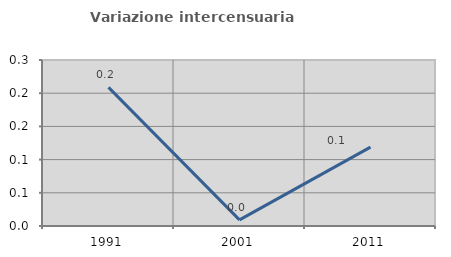
| Category | Variazione intercensuaria annua |
|---|---|
| 1991.0 | 0.209 |
| 2001.0 | 0.009 |
| 2011.0 | 0.119 |